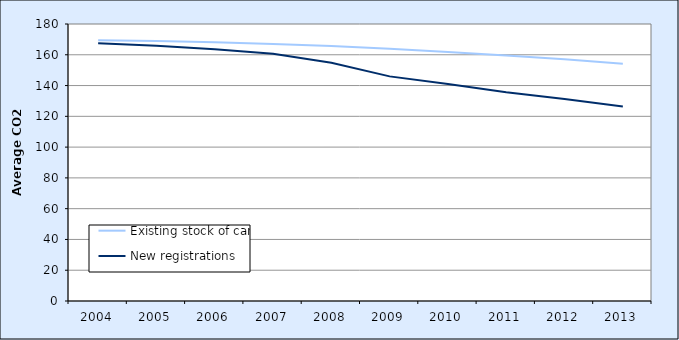
| Category | Existing stock of cars | New registrations |
|---|---|---|
| 2004.0 | 169.421 | 167.476 |
| 2005.0 | 168.877 | 165.917 |
| 2006.0 | 168.119 | 163.537 |
| 2007.0 | 167.067 | 160.717 |
| 2008.0 | 165.695 | 154.784 |
| 2009.0 | 163.893 | 145.958 |
| 2010.0 | 161.729 | 141.026 |
| 2011.0 | 159.511 | 135.686 |
| 2012.0 | 157.101 | 131.206 |
| 2013.0 | 154.156 | 126.448 |